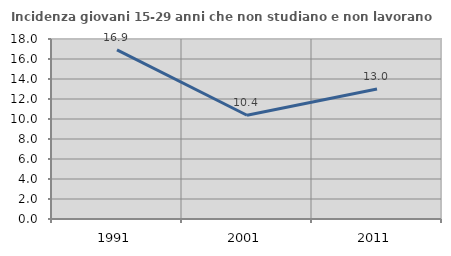
| Category | Incidenza giovani 15-29 anni che non studiano e non lavorano  |
|---|---|
| 1991.0 | 16.921 |
| 2001.0 | 10.372 |
| 2011.0 | 13 |